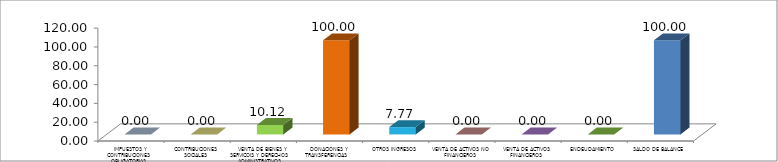
| Category | Series 0 |
|---|---|
|  IMPUESTOS Y CONTRIBUCIONES OBLIGATORIAS | 0 |
|  CONTRIBUCIONES SOCIALES | 0 |
|  VENTA DE BIENES Y SERVICOIS Y DERECHOS ADMINISTRATIVOS | 10.117 |
|  DONACIONES Y TRANSFERENCIAS | 100 |
|  OTROS INGRESOS | 7.771 |
|  VENTA DE ACTIVOS NO FINANCIEROS | 0 |
|  VENTA DE ACTIVOS FINANCIEROS | 0 |
|  ENDEUDAMIENTO | 0 |
|  SALDO DE BALANCE | 100 |